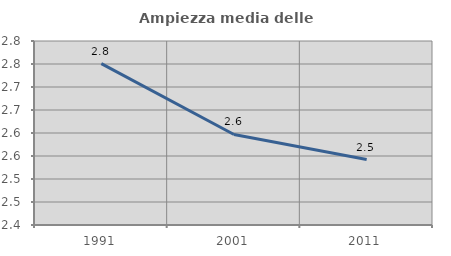
| Category | Ampiezza media delle famiglie |
|---|---|
| 1991.0 | 2.751 |
| 2001.0 | 2.597 |
| 2011.0 | 2.542 |